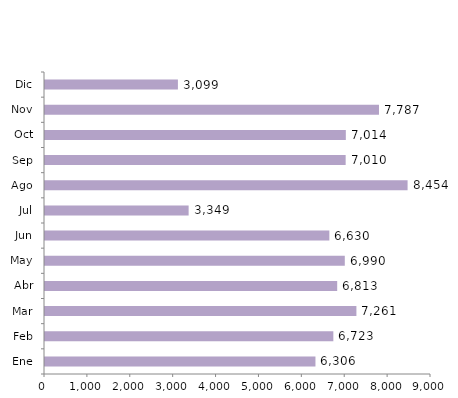
| Category | Series 0 |
|---|---|
| Ene | 6306 |
| Feb | 6723 |
| Mar | 7261 |
| Abr | 6813 |
| May | 6990 |
| Jun | 6630 |
| Jul | 3349 |
| Ago | 8454 |
| Sep | 7010 |
| Oct | 7014 |
| Nov | 7787 |
| Dic | 3099 |